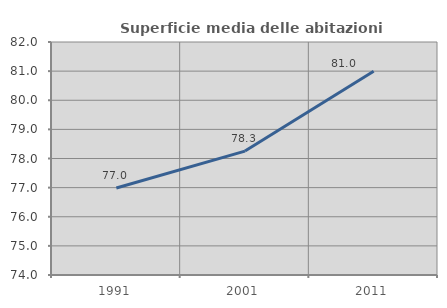
| Category | Superficie media delle abitazioni occupate |
|---|---|
| 1991.0 | 76.989 |
| 2001.0 | 78.254 |
| 2011.0 | 80.996 |